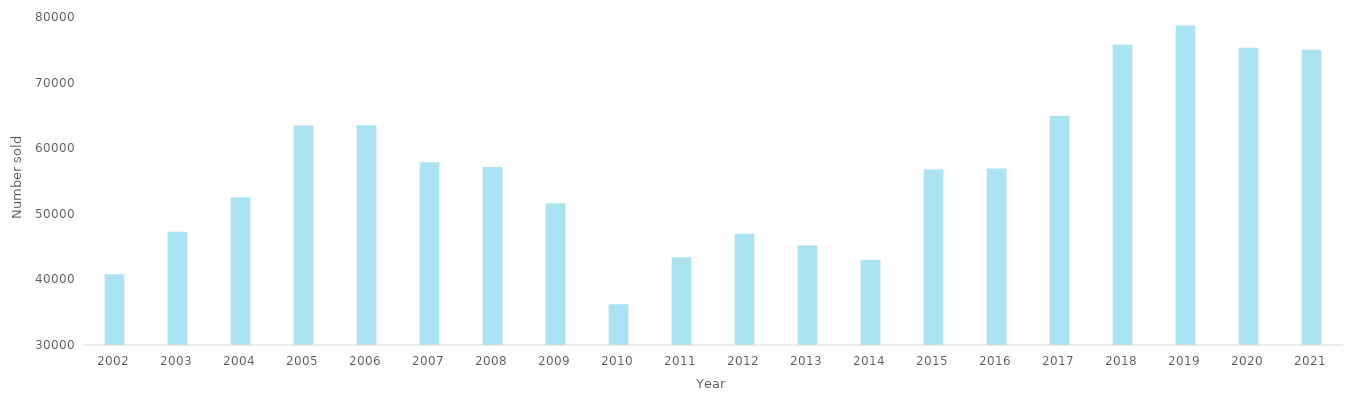
| Category | Series 0 |
|---|---|
| 2002.0 | 40802 |
| 2003.0 | 47248 |
| 2004.0 | 52508 |
| 2005.0 | 63514 |
| 2006.0 | 63482 |
| 2007.0 | 57861 |
| 2008.0 | 57142 |
| 2009.0 | 51594 |
| 2010.0 | 36214 |
| 2011.0 | 43389 |
| 2012.0 | 46961 |
| 2013.0 | 45169 |
| 2014.0 | 42996 |
| 2015.0 | 56762 |
| 2016.0 | 56906 |
| 2017.0 | 64951 |
| 2018.0 | 75777 |
| 2019.0 | 78693 |
| 2020.0 | 75294 |
| 2021.0 | 75008 |